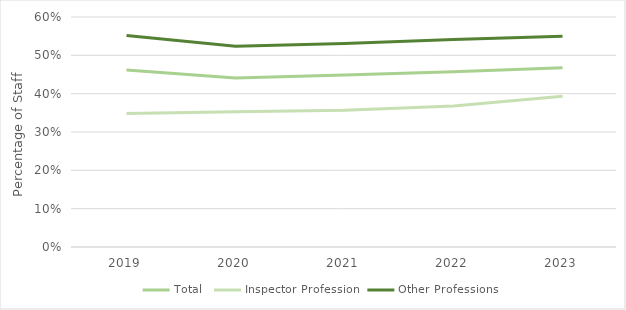
| Category | Total | Inspector Profession | Other Professions |
|---|---|---|---|
| 2019.0 | 0.462 | 0.348 | 0.552 |
| 2020.0 | 0.441 | 0.353 | 0.524 |
| 2021.0 | 0.449 | 0.357 | 0.531 |
| 2022.0 | 0.457 | 0.368 | 0.541 |
| 2023.0 | 0.468 | 0.393 | 0.55 |